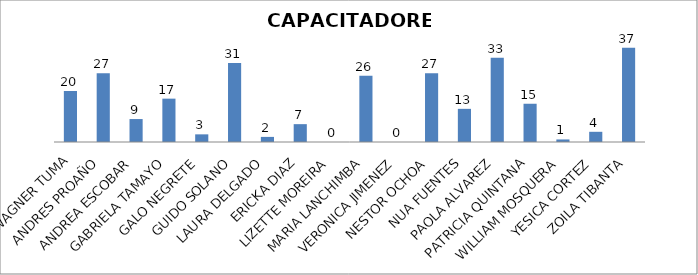
| Category | Series 0 |
|---|---|
| WAGNER TUMA | 20 |
| ANDRES PROAÑO | 27 |
| ANDREA ESCOBAR | 9 |
| GABRIELA TAMAYO | 17 |
| GALO NEGRETE | 3 |
| GUIDO SOLANO | 31 |
| LAURA DELGADO | 2 |
| ERICKA DIAZ | 7 |
| LIZETTE MOREIRA | 0 |
| MARIA LANCHIMBA | 26 |
| VERONICA JIMENEZ | 0 |
| NESTOR OCHOA | 27 |
| NUA FUENTES | 13 |
| PAOLA ALVAREZ | 33 |
| PATRICIA QUINTANA | 15 |
| WILLIAM MOSQUERA | 1 |
| YESICA CORTEZ | 4 |
| ZOILA TIBANTA | 37 |